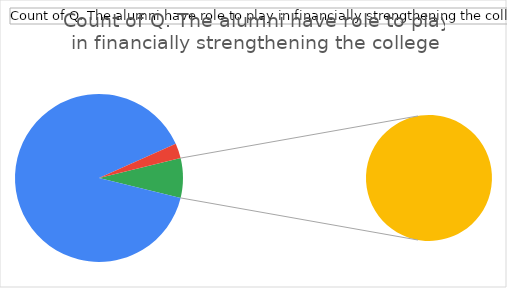
| Category | Total |
|---|---|
| Agree | 94 |
| Disagree | 3 |
| Neutral | 8 |